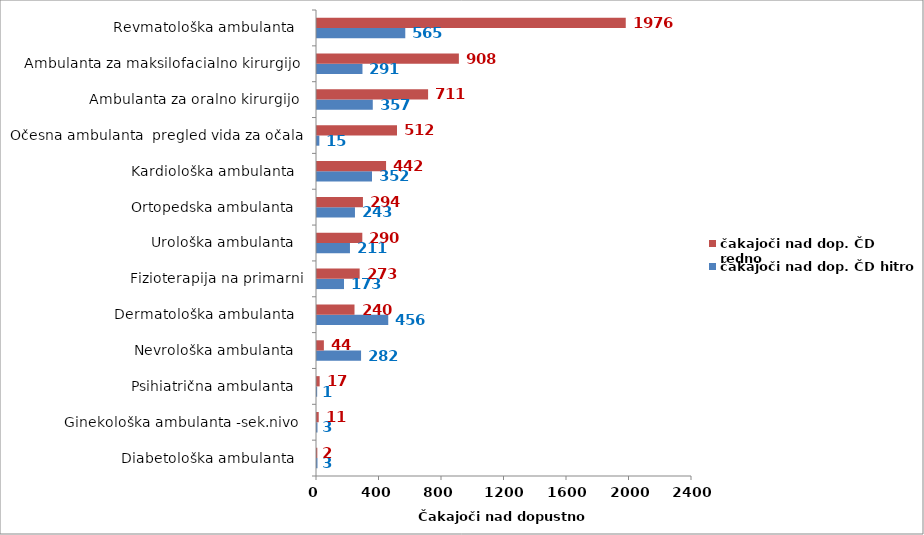
| Category | čakajoči nad dop. ČD hitro | čakajoči nad dop. ČD redno |
|---|---|---|
| Diabetološka ambulanta   | 3 | 2 |
| Ginekološka ambulanta -sek.nivo  | 3 | 11 |
| Psihiatrična ambulanta   | 1 | 17 |
| Nevrološka ambulanta   | 282 | 44 |
| Dermatološka ambulanta   | 456 | 240 |
| Fizioterapija na primarni | 173 | 273 |
| Urološka ambulanta   | 211 | 290 |
| Ortopedska ambulanta   | 243 | 294 |
| Kardiološka ambulanta   | 352 | 442 |
| Očesna ambulanta  pregled vida za očala | 15 | 512 |
| Ambulanta za oralno kirurgijo  | 357 | 711 |
| Ambulanta za maksilofacialno kirurgijo  | 291 | 908 |
| Revmatološka ambulanta   | 565 | 1976 |